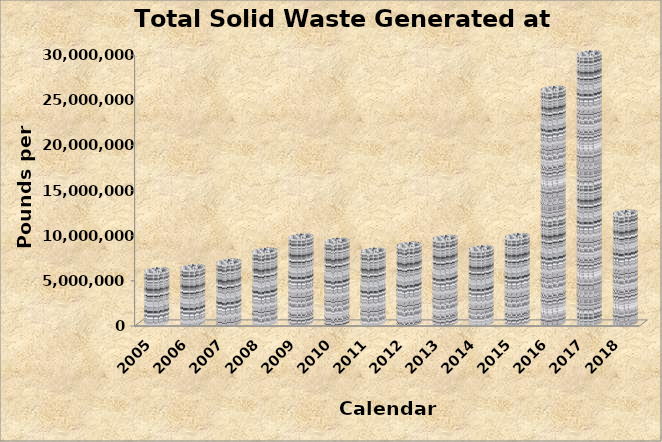
| Category | Calendar Year |
|---|---|
| 2018 | 12217590.46 |
| 2017 | 29868250.5 |
| 2016 | 25941496.47 |
| 2015 | 9632871 |
| 2014 | 8286081 |
| 2013 | 9431786 |
| 2012 | 8680436 |
| 2011 | 8023186 |
| 2010 | 9127127 |
| 2009 | 9594815 |
| 2008 | 8011387 |
| 2007 | 6796580 |
| 2006 | 6180709 |
| 2005 | 5841672 |